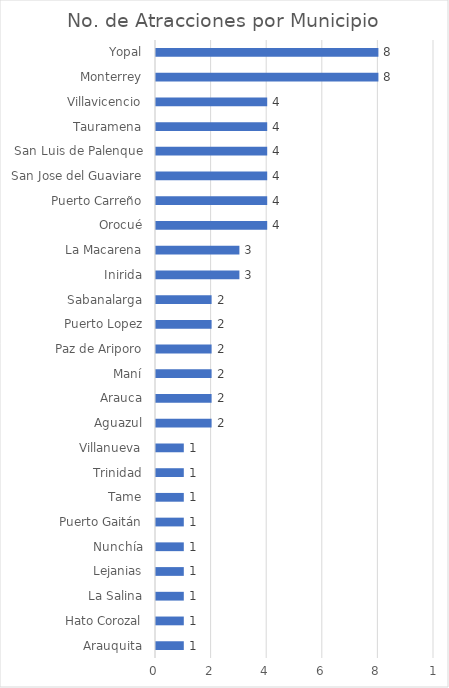
| Category | Atracciones |
|---|---|
| Arauquita | 1 |
| Hato Corozal | 1 |
| La Salina | 1 |
| Lejanias | 1 |
| Nunchía | 1 |
| Puerto Gaitán | 1 |
| Tame | 1 |
| Trinidad | 1 |
| Villanueva | 1 |
| Aguazul | 2 |
| Arauca | 2 |
| Maní | 2 |
| Paz de Ariporo | 2 |
| Puerto Lopez | 2 |
| Sabanalarga | 2 |
| Inirida | 3 |
| La Macarena | 3 |
| Orocué | 4 |
| Puerto Carreño | 4 |
| San Jose del Guaviare | 4 |
| San Luis de Palenque | 4 |
| Tauramena | 4 |
| Villavicencio | 4 |
| Monterrey | 8 |
| Yopal | 8 |